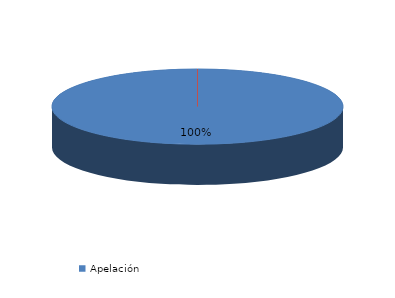
| Category | Series 0 |
|---|---|
| Apelación | 2 |
| Casación | 0 |